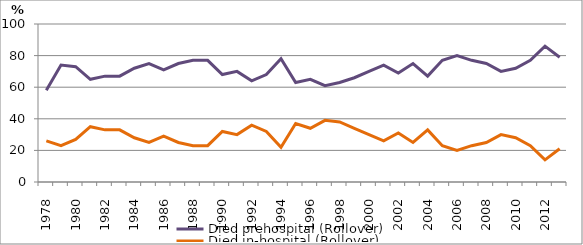
| Category | Died prehospital (Rollover) | Died in-hospital (Rollover) |
|---|---|---|
| 1978.0 | 58 | 26 |
| 1979.0 | 74 | 23 |
| 1980.0 | 73 | 27 |
| 1981.0 | 65 | 35 |
| 1982.0 | 67 | 33 |
| 1983.0 | 67 | 33 |
| 1984.0 | 72 | 28 |
| 1985.0 | 75 | 25 |
| 1986.0 | 71 | 29 |
| 1987.0 | 75 | 25 |
| 1988.0 | 77 | 23 |
| 1989.0 | 77 | 23 |
| 1990.0 | 68 | 32 |
| 1991.0 | 70 | 30 |
| 1992.0 | 64 | 36 |
| 1993.0 | 68 | 32 |
| 1994.0 | 78 | 22 |
| 1995.0 | 63 | 37 |
| 1996.0 | 65 | 34 |
| 1997.0 | 61 | 39 |
| 1998.0 | 63 | 38 |
| 1999.0 | 66 | 34 |
| 2000.0 | 70 | 30 |
| 2001.0 | 74 | 26 |
| 2002.0 | 69 | 31 |
| 2003.0 | 75 | 25 |
| 2004.0 | 67 | 33 |
| 2005.0 | 77 | 23 |
| 2006.0 | 80 | 20 |
| 2007.0 | 77 | 23 |
| 2008.0 | 75 | 25 |
| 2009.0 | 70 | 30 |
| 2010.0 | 72 | 28 |
| 2011.0 | 77 | 23 |
| 2012.0 | 86 | 14 |
| 2013.0 | 79 | 21 |